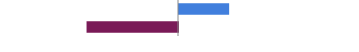
| Category | Series 0 |
|---|---|
| Favorable | 0.283 |
| Unfavorable | -0.517 |